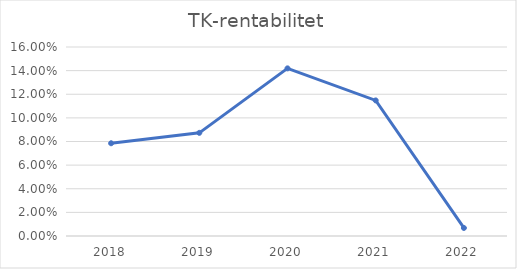
| Category | TK-rentabilitet |
|---|---|
| 2018.0 | 0.079 |
| 2019.0 | 0.087 |
| 2020.0 | 0.142 |
| 2021.0 | 0.115 |
| 2022.0 | 0.007 |